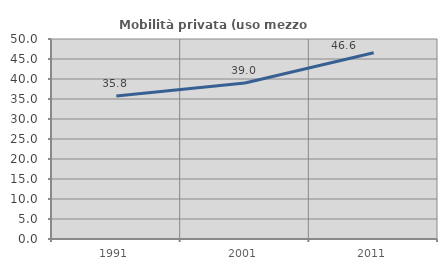
| Category | Mobilità privata (uso mezzo privato) |
|---|---|
| 1991.0 | 35.752 |
| 2001.0 | 38.994 |
| 2011.0 | 46.552 |